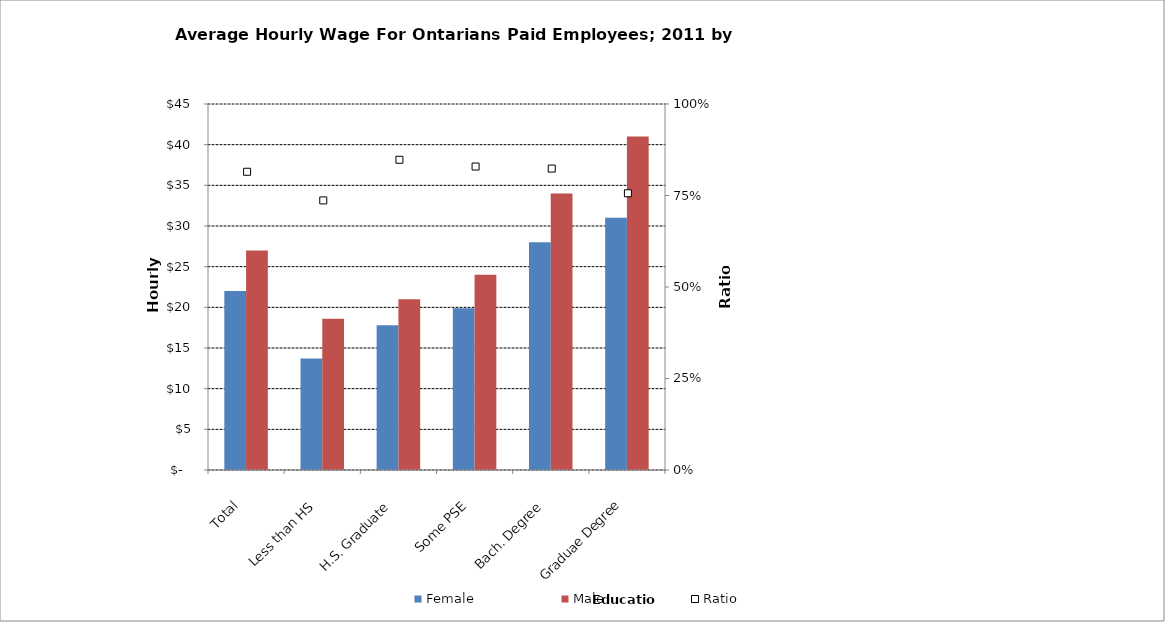
| Category | Female | Male |
|---|---|---|
| Total | 22 | 27 |
|  Less than HS  | 13.7 | 18.6 |
|  H.S. Graduate  | 17.8 | 21 |
|  Some PSE  | 19.9 | 24 |
|  Bach. Degree  | 28 | 34 |
|  Graduae Degree  | 31 | 41 |